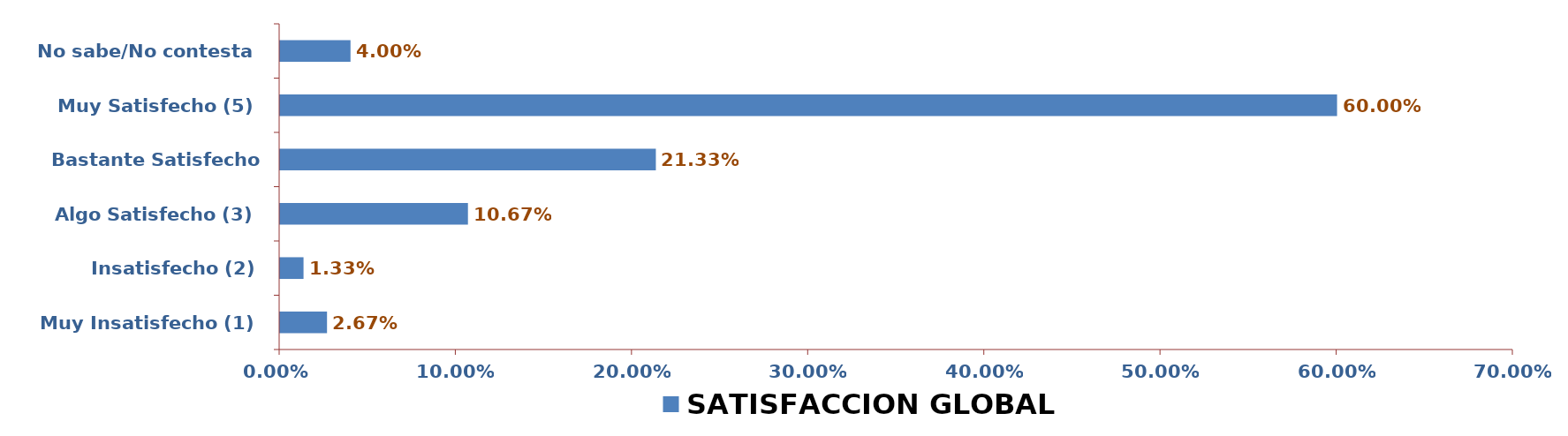
| Category | SATISFACCIÓN GLOBAL |
|---|---|
| Muy Insatisfecho (1) | 0.027 |
| Insatisfecho (2) | 0.013 |
| Algo Satisfecho (3) | 0.107 |
| Bastante Satisfecho (4) | 0.213 |
| Muy Satisfecho (5) | 0.6 |
| No sabe/No contesta | 0.04 |